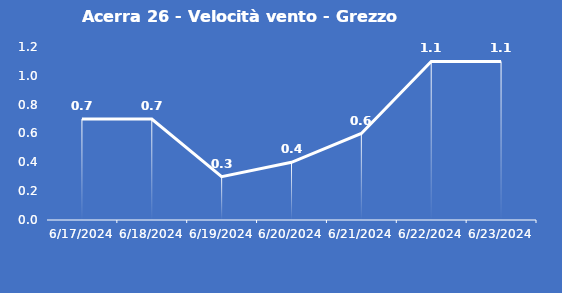
| Category | Acerra 26 - Velocità vento - Grezzo (m/s) |
|---|---|
| 6/17/24 | 0.7 |
| 6/18/24 | 0.7 |
| 6/19/24 | 0.3 |
| 6/20/24 | 0.4 |
| 6/21/24 | 0.6 |
| 6/22/24 | 1.1 |
| 6/23/24 | 1.1 |